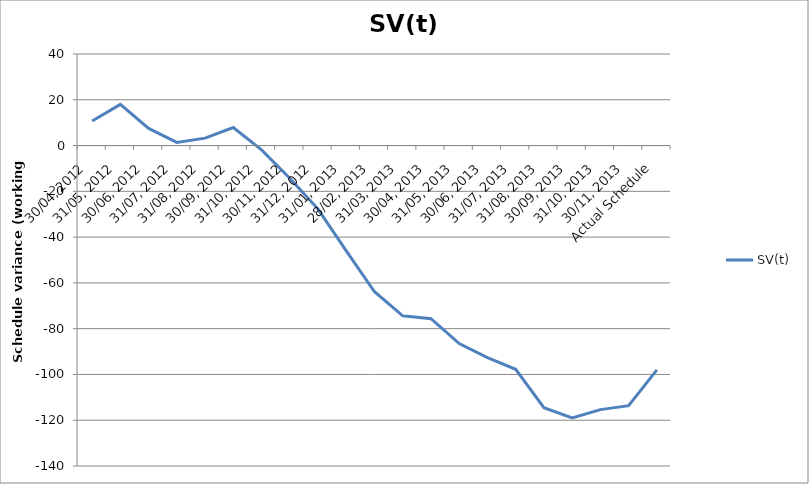
| Category | SV(t) |
|---|---|
| 30/04, 2012 | 10.75 |
| 31/05, 2012 | 18 |
| 30/06, 2012 | 7.5 |
| 31/07, 2012 | 1.375 |
| 31/08, 2012 | 3.25 |
| 30/09, 2012 | 7.875 |
| 31/10, 2012 | -1.875 |
| 30/11, 2012 | -14.25 |
| 31/12, 2012 | -27.75 |
| 31/01, 2013 | -46 |
| 28/02, 2013 | -63.875 |
| 31/03, 2013 | -74.375 |
| 30/04, 2013 | -75.625 |
| 31/05, 2013 | -86.5 |
| 30/06, 2013 | -92.625 |
| 31/07, 2013 | -97.75 |
| 31/08, 2013 | -114.5 |
| 30/09, 2013 | -119 |
| 31/10, 2013 | -115.375 |
| 30/11, 2013 | -113.625 |
| Actual Schedule | -98 |